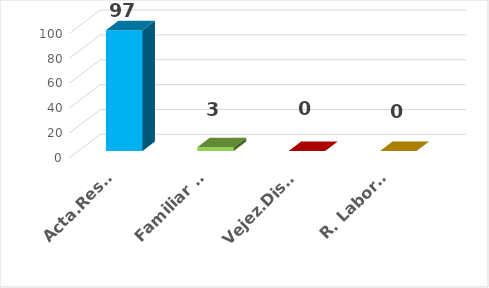
| Category | Series 0 |
|---|---|
| Acta.Res. Doc | 97 |
| Familiar de Salud | 3 |
| Vejez.Disc.Sobrev. | 0 |
| R. Laborales | 0 |